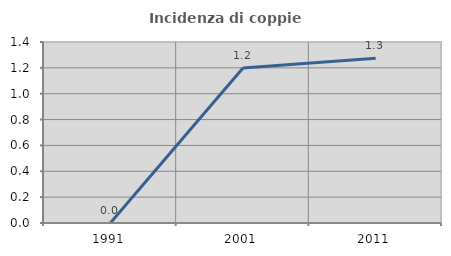
| Category | Incidenza di coppie miste |
|---|---|
| 1991.0 | 0 |
| 2001.0 | 1.199 |
| 2011.0 | 1.274 |